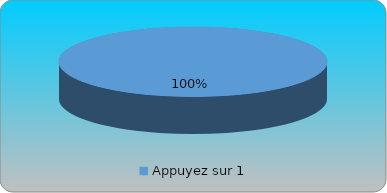
| Category | Series 0 | Series 1 | Series 2 | Series 3 |
|---|---|---|---|---|
| Appuyez sur 1 | 1 |  |  |  |